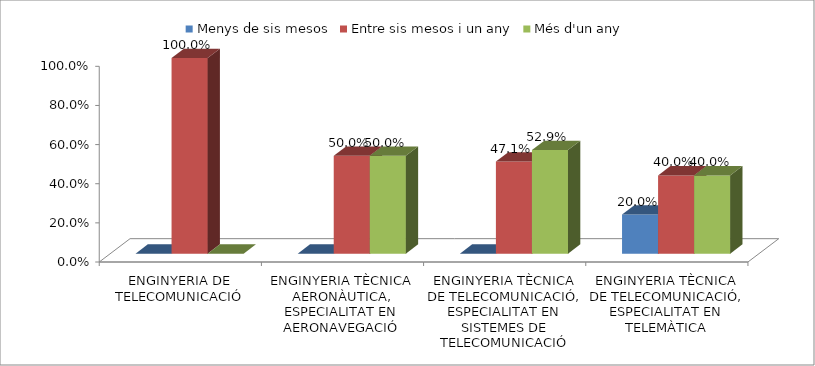
| Category | Menys de sis mesos | Entre sis mesos i un any | Més d'un any |
|---|---|---|---|
| ENGINYERIA DE TELECOMUNICACIÓ | 0 | 1 | 0 |
| ENGINYERIA TÈCNICA AERONÀUTICA, ESPECIALITAT EN AERONAVEGACIÓ | 0 | 0.5 | 0.5 |
| ENGINYERIA TÈCNICA DE TELECOMUNICACIÓ, ESPECIALITAT EN SISTEMES DE TELECOMUNICACIÓ | 0 | 0.471 | 0.529 |
| ENGINYERIA TÈCNICA DE TELECOMUNICACIÓ, ESPECIALITAT EN TELEMÀTICA | 0.2 | 0.4 | 0.4 |